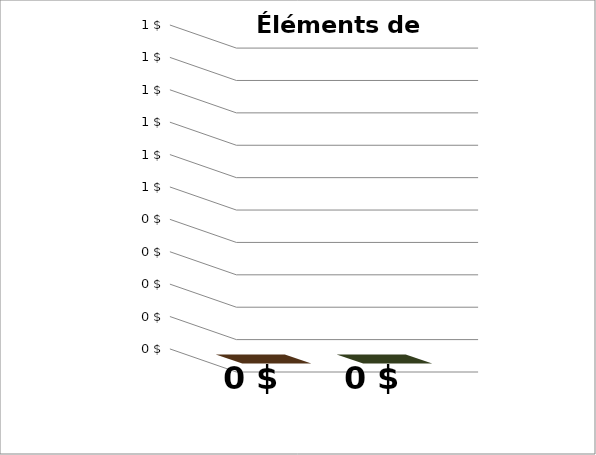
| Category | Series 0 |
|---|---|
| Ce que vous dépensez en nourriture | 0 |
| Ce que le ménage canadien moyen de la taille du vôtre dépense en nourriture | 0 |